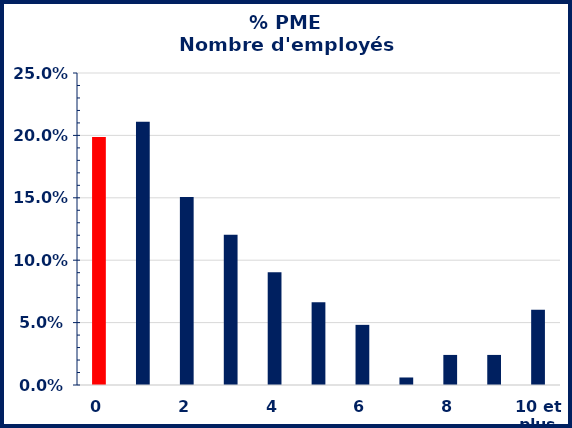
| Category | Series 0 |
|---|---|
| 0 | 0.199 |
| 1 | 0.211 |
| 2 | 0.151 |
| 3 | 0.12 |
| 4 | 0.09 |
| 5 | 0.066 |
| 6 | 0.048 |
| 7 | 0.006 |
| 8 | 0.024 |
| 9 | 0.024 |
| 10 et plus | 0.06 |